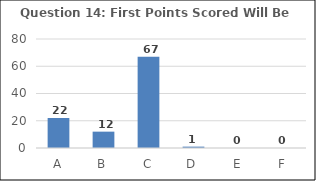
| Category | Series 0 |
|---|---|
| A | 22 |
| B | 12 |
| C | 67 |
| D | 1 |
| E | 0 |
| F | 0 |